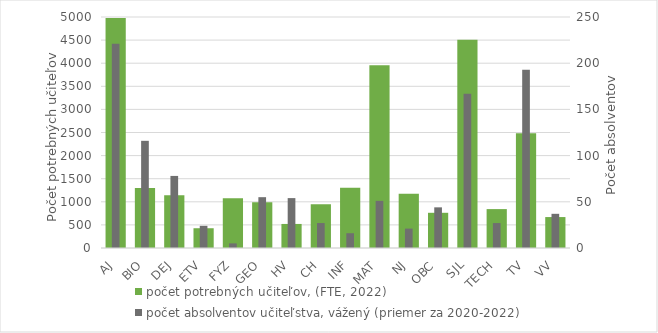
| Category | počet potrebných učiteľov, (FTE, 2022) |
|---|---|
| AJ | 4975.957 |
| BIO | 1299.609 |
| DEJ | 1139.261 |
| ETV | 427.826 |
| FYZ | 1079.043 |
| GEO | 992.913 |
| HV | 520.652 |
| CH | 944.522 |
| INF | 1303.87 |
| MAT | 3952.957 |
| NJ | 1175.478 |
| OBC | 762 |
| SJL | 4506.696 |
| TECH | 842.043 |
| TV | 2484.261 |
| VV | 669.652 |